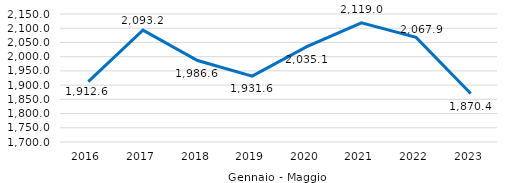
| Category | Series 0 |
|---|---|
| 0 | 1912.562 |
| 1 | 2093.239 |
| 2 | 1986.553 |
| 3 | 1931.629 |
| 4 | 2035.076 |
| 5 | 2118.967 |
| 6 | 2067.894 |
| 7 | 1870.448 |